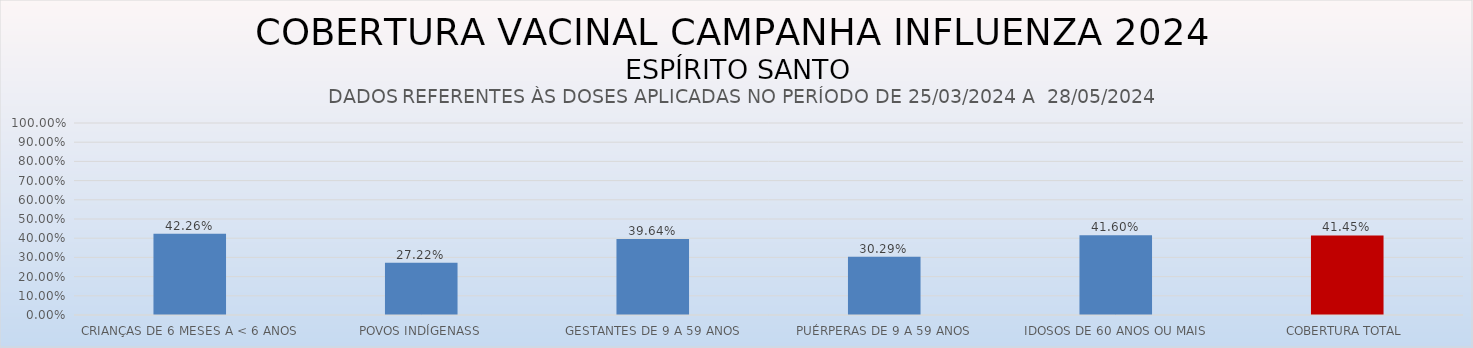
| Category | COBERTURA VACINAL |
|---|---|
| CRIANÇAS DE 6 MESES A < 6 ANOS | 0.423 |
| POVOS INDÍGENASS | 0.272 |
| GESTANTES DE 9 A 59 ANOS | 0.396 |
| PUÉRPERAS DE 9 A 59 ANOS | 0.303 |
| IDOSOS DE 60 ANOS OU MAIS | 0.416 |
| COBERTURA TOTAL | 0.414 |